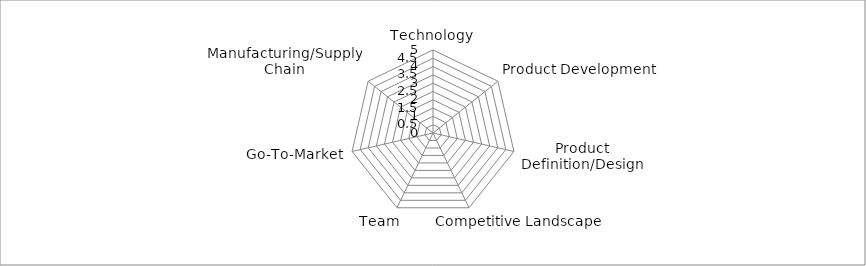
| Category | Series 0 |
|---|---|
| Technology | 0 |
| Product Development | 0 |
| Product Definition/Design | 0 |
| Competitive Landscape | 0 |
| Team | 0 |
| Go-To-Market | 0 |
| Manufacturing/Supply Chain | 0 |